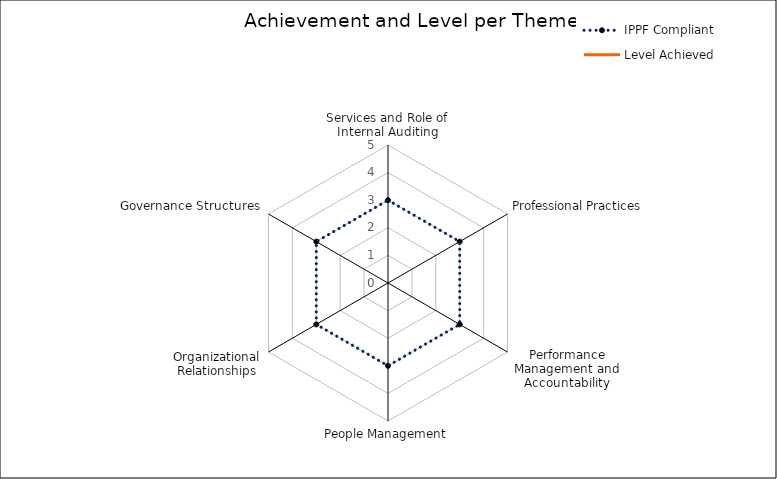
| Category | IPPF Compliant | Level Achieved |
|---|---|---|
| 0 | 3 | 0 |
| 1 | 3 | 0 |
| 2 | 3 | 0 |
| 3 | 3 | 0 |
| 4 | 3 | 0 |
| 5 | 3 | 0 |